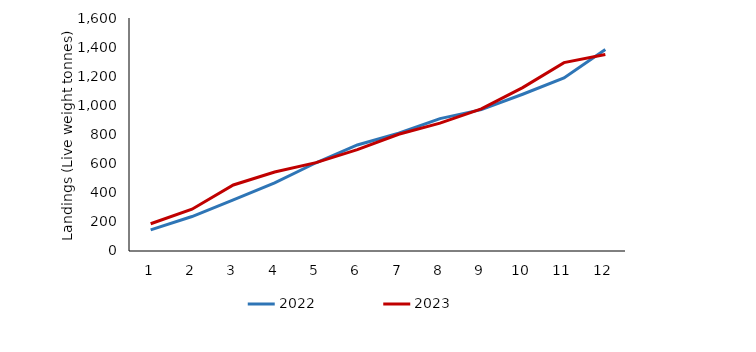
| Category | 2022 | 2023 |
|---|---|---|
| 0 | 145.088 | 186.944 |
| 1 | 236.634 | 286.916 |
| 2 | 351.03 | 453.314 |
| 3 | 467.682 | 542.705 |
| 4 | 605.938 | 606.666 |
| 5 | 728.154 | 696.228 |
| 6 | 808.558 | 801.64 |
| 7 | 909.085 | 877.878 |
| 8 | 970.618 | 975.65 |
| 9 | 1076.529 | 1122.128 |
| 10 | 1188.718 | 1293.622 |
| 11 | 1384.442 | 1349.348 |